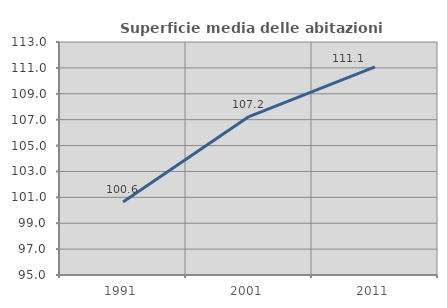
| Category | Superficie media delle abitazioni occupate |
|---|---|
| 1991.0 | 100.631 |
| 2001.0 | 107.24 |
| 2011.0 | 111.071 |